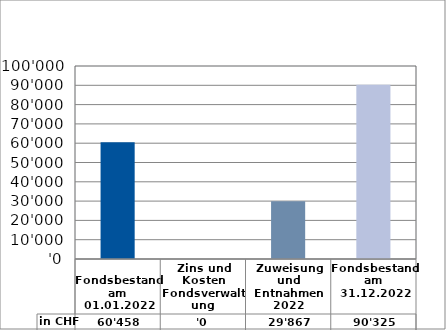
| Category | in CHF |
|---|---|
| 
Fondsbestand am 01.01.2022

 | 60458 |
| Zins und Kosten Fondsverwaltung | 0 |
| Zuweisung und Entnahmen 2022 | 29867.2 |
| Fondsbestand am 31.12.2022 | 90325.2 |